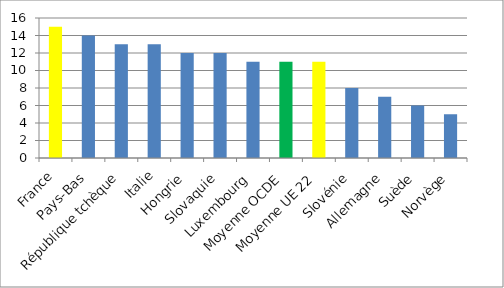
| Category | Series 0 |
|---|---|
| France | 15 |
| Pays-Bas | 14 |
| République tchèque | 13 |
| Italie | 13 |
| Hongrie | 12 |
| Slovaquie | 12 |
| Luxembourg | 11 |
| Moyenne OCDE | 11 |
| Moyenne UE 22 | 11 |
| Slovénie | 8 |
| Allemagne | 7 |
| Suède | 6 |
| Norvège | 5 |